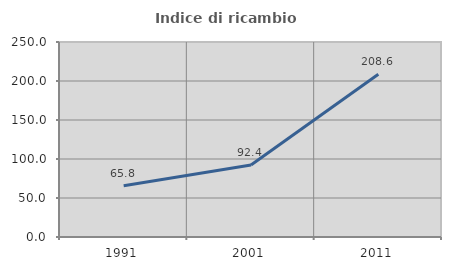
| Category | Indice di ricambio occupazionale  |
|---|---|
| 1991.0 | 65.836 |
| 2001.0 | 92.373 |
| 2011.0 | 208.611 |